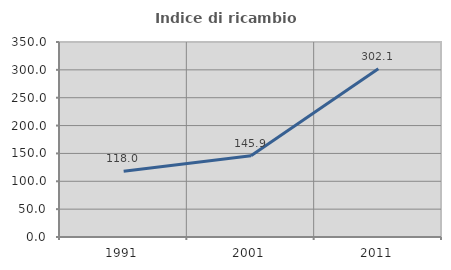
| Category | Indice di ricambio occupazionale  |
|---|---|
| 1991.0 | 117.959 |
| 2001.0 | 145.923 |
| 2011.0 | 302.128 |